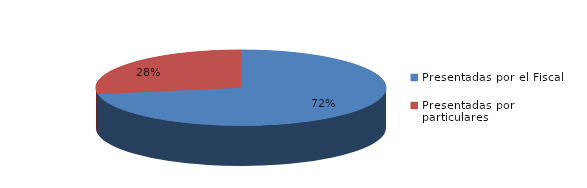
| Category | Series 0 |
|---|---|
| Presentadas por el Fiscal | 196 |
| Presentadas por particulares | 75 |